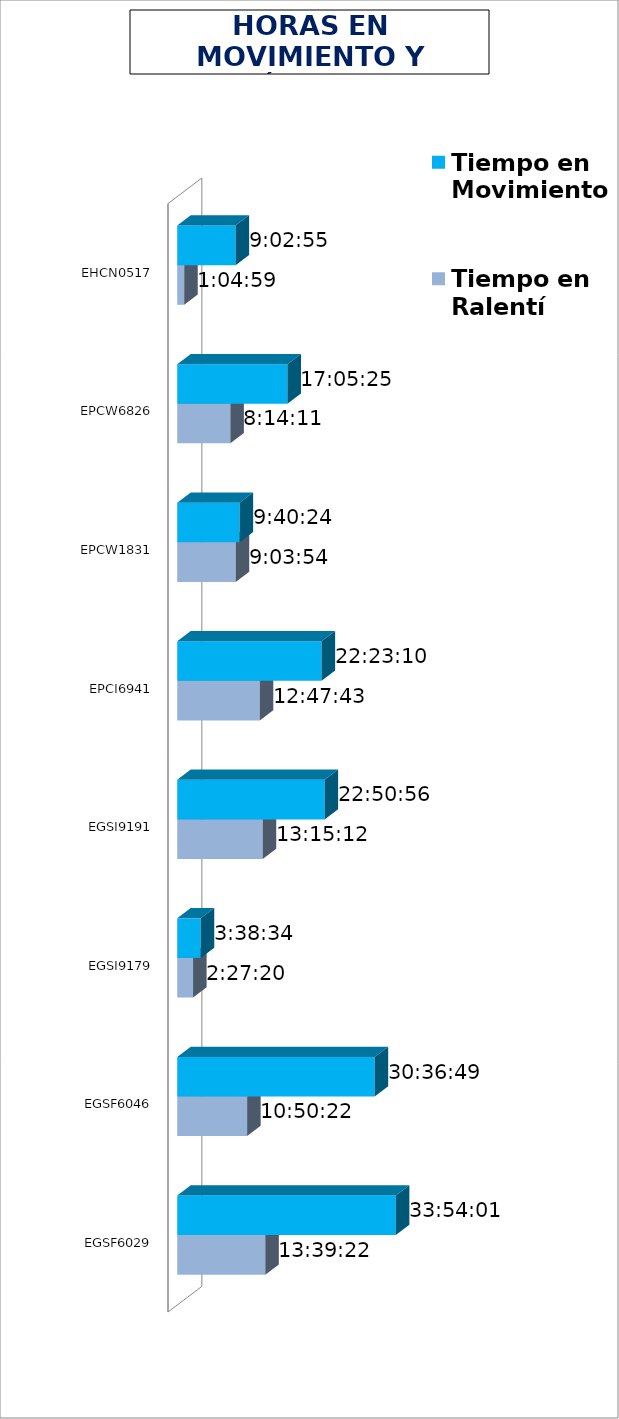
| Category | Tiempo en Ralentí | Tiempo en Movimiento |
|---|---|---|
| EGSF6029 | 0.569 | 1900-01-01 09:54:01 |
| EGSF6046 | 0.452 | 1900-01-01 06:36:49 |
| EGSI9179 | 0.102 | 0.152 |
| EGSI9191 | 0.552 | 0.952 |
| EPCI6941 | 0.533 | 0.933 |
| EPCW1831 | 0.378 | 0.403 |
| EPCW6826 | 0.343 | 0.712 |
| EHCN0517 | 0.045 | 0.377 |